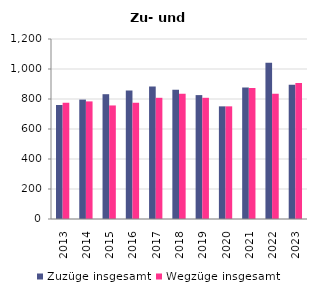
| Category | Zuzüge insgesamt | Wegzüge insgesamt |
|---|---|---|
| 2013.0 | 760 | 775 |
| 2014.0 | 796 | 784 |
| 2015.0 | 832 | 757 |
| 2016.0 | 856 | 775 |
| 2017.0 | 883 | 808 |
| 2018.0 | 862 | 835 |
| 2019.0 | 826 | 808 |
| 2020.0 | 751 | 751 |
| 2021.0 | 877 | 874 |
| 2022.0 | 1042 | 835 |
| 2023.0 | 895 | 907 |